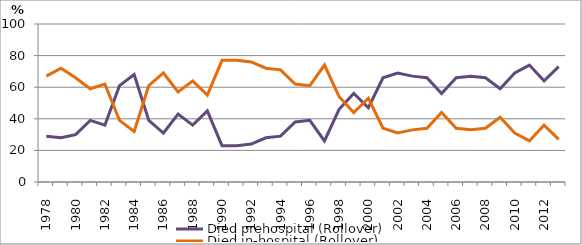
| Category | Died prehospital (Rollover) | Died in-hospital (Rollover) |
|---|---|---|
| 1978.0 | 29 | 67 |
| 1979.0 | 28 | 72 |
| 1980.0 | 30 | 66 |
| 1981.0 | 39 | 59 |
| 1982.0 | 36 | 62 |
| 1983.0 | 61 | 39 |
| 1984.0 | 68 | 32 |
| 1985.0 | 39 | 61 |
| 1986.0 | 31 | 69 |
| 1987.0 | 43 | 57 |
| 1988.0 | 36 | 64 |
| 1989.0 | 45 | 55 |
| 1990.0 | 23 | 77 |
| 1991.0 | 23 | 77 |
| 1992.0 | 24 | 76 |
| 1993.0 | 28 | 72 |
| 1994.0 | 29 | 71 |
| 1995.0 | 38 | 62 |
| 1996.0 | 39 | 61 |
| 1997.0 | 26 | 74 |
| 1998.0 | 46 | 54 |
| 1999.0 | 56 | 44 |
| 2000.0 | 47 | 53 |
| 2001.0 | 66 | 34 |
| 2002.0 | 69 | 31 |
| 2003.0 | 67 | 33 |
| 2004.0 | 66 | 34 |
| 2005.0 | 56 | 44 |
| 2006.0 | 66 | 34 |
| 2007.0 | 67 | 33 |
| 2008.0 | 66 | 34 |
| 2009.0 | 59 | 41 |
| 2010.0 | 69 | 31 |
| 2011.0 | 74 | 26 |
| 2012.0 | 64 | 36 |
| 2013.0 | 73 | 27 |